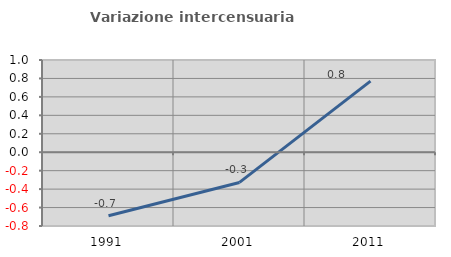
| Category | Variazione intercensuaria annua |
|---|---|
| 1991.0 | -0.689 |
| 2001.0 | -0.328 |
| 2011.0 | 0.771 |